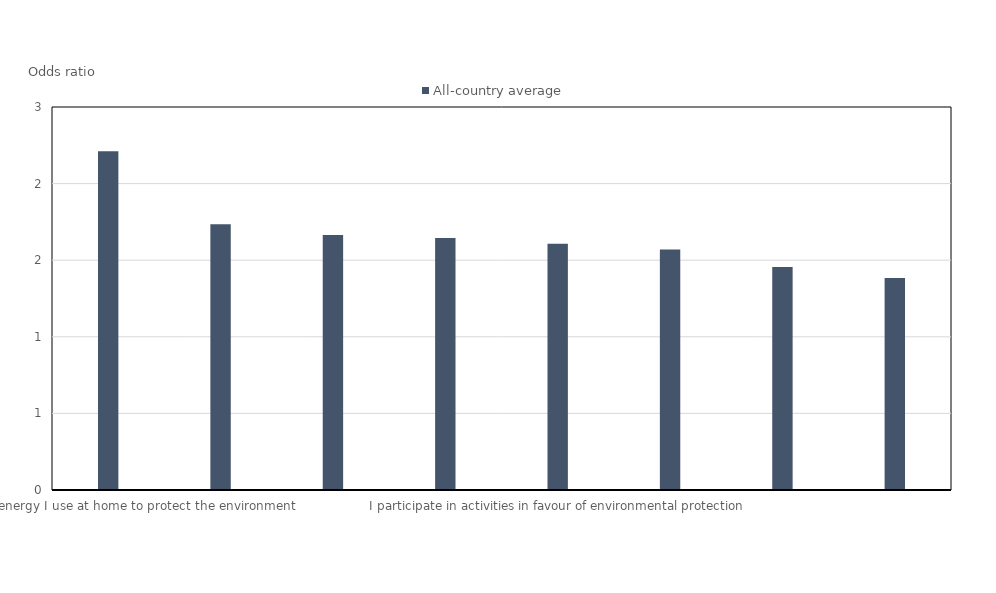
| Category | All-country average |
|---|---|
| I reduce the energy I use at home to protect the environment | 2.211 |
| I choose certain products for ethical or environmental reasons,
even if they are a bit more expensive | 1.735 |
| I boycott products or companies for political, ethical or environmental reasons | 1.665 |
| I participate in activities promoting equality between men and women | 1.646 |
| I participate in activities in favour of environmental protection | 1.608 |
| I sign environmental or social petitions on line | 1.569 |
| I keep myself informed about world events via <Twitter> or <Facebook> | 1.456 |
| I regularly read websites on international social issues (e.g. poverty, human rights) | 1.384 |